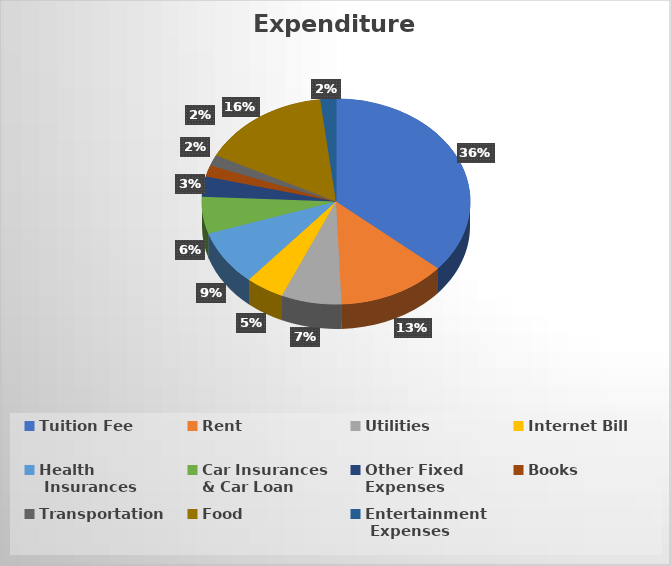
| Category | Series 0 |
|---|---|
| Tuition Fee | 15000 |
| Rent | 5400 |
| Utilities | 3000 |
| Internet Bill | 1920 |
| Health
 Insurances | 3600 |
| Car Insurances 
& Car Loan | 2400 |
| Other Fixed 
Expenses | 1320 |
| Books | 738 |
| Transportation | 692 |
| Food | 6500 |
| Entertainment
 Expenses | 780 |